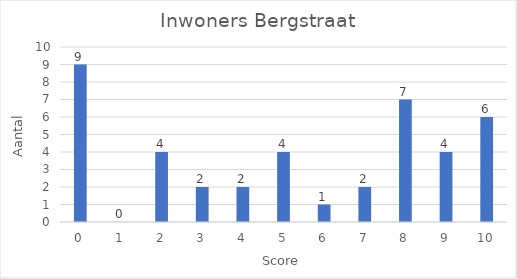
| Category | Aantal |
|---|---|
| 0.0 | 9 |
| 1.0 | 0 |
| 2.0 | 4 |
| 3.0 | 2 |
| 4.0 | 2 |
| 5.0 | 4 |
| 6.0 | 1 |
| 7.0 | 2 |
| 8.0 | 7 |
| 9.0 | 4 |
| 10.0 | 6 |